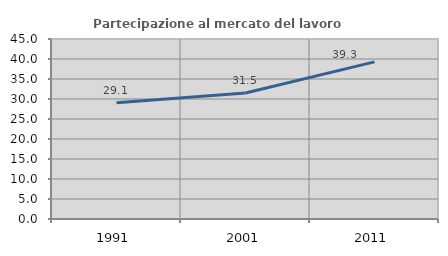
| Category | Partecipazione al mercato del lavoro  femminile |
|---|---|
| 1991.0 | 29.053 |
| 2001.0 | 31.513 |
| 2011.0 | 39.279 |